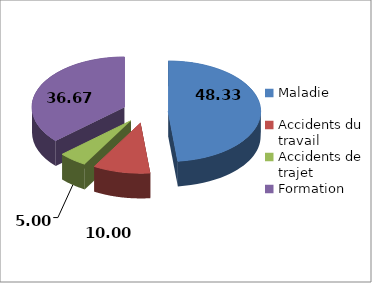
| Category | Series 0 |
|---|---|
| Maladie | 48.333 |
| Accidents du travail | 10 |
| Accidents de trajet | 5 |
| Formation | 36.667 |